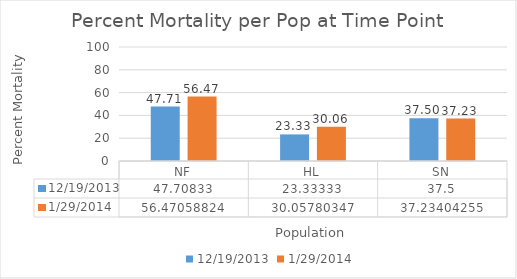
| Category | 12/19/2013 | 1/29/2014 |
|---|---|---|
| NF | 47.708 | 56.471 |
| HL | 23.333 | 30.058 |
| SN | 37.5 | 37.234 |